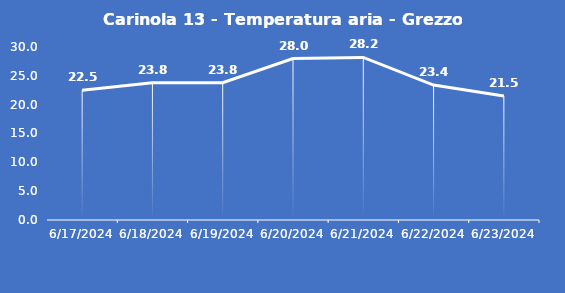
| Category | Carinola 13 - Temperatura aria - Grezzo (°C) |
|---|---|
| 6/17/24 | 22.5 |
| 6/18/24 | 23.8 |
| 6/19/24 | 23.8 |
| 6/20/24 | 28 |
| 6/21/24 | 28.2 |
| 6/22/24 | 23.4 |
| 6/23/24 | 21.5 |